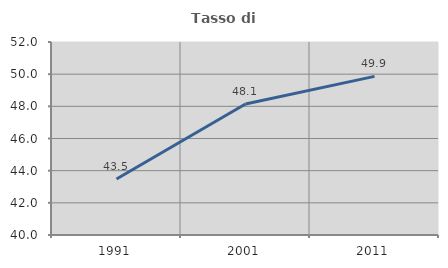
| Category | Tasso di occupazione   |
|---|---|
| 1991.0 | 43.483 |
| 2001.0 | 48.141 |
| 2011.0 | 49.862 |